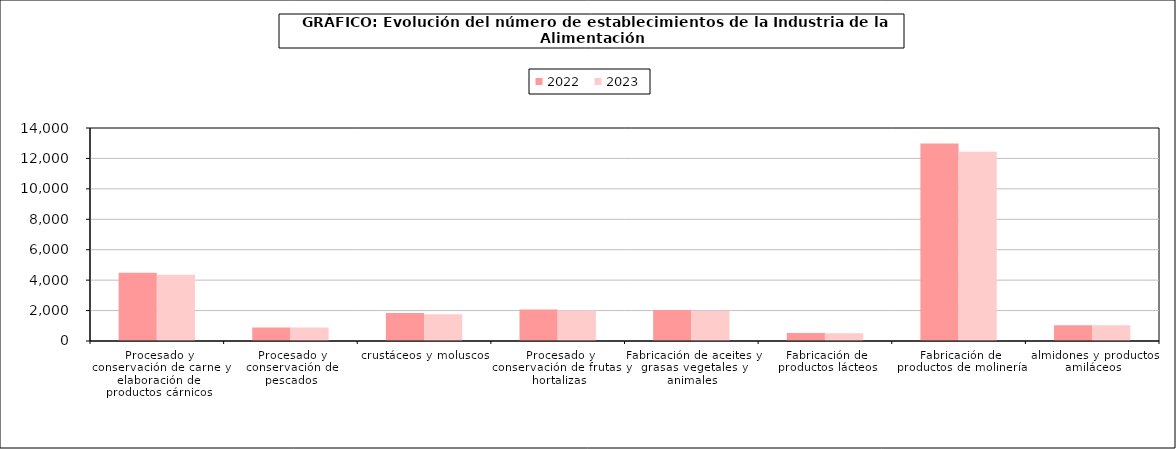
| Category | 2022 | 2023 |
|---|---|---|
| 0 | 4490 | 4347 |
| 1 | 894 | 881 |
| 2 | 1846 | 1754 |
| 3 | 2071 | 2011 |
| 4 | 2032 | 1990 |
| 5 | 521 | 515 |
| 6 | 12987 | 12443 |
| 7 | 1038 | 1028 |